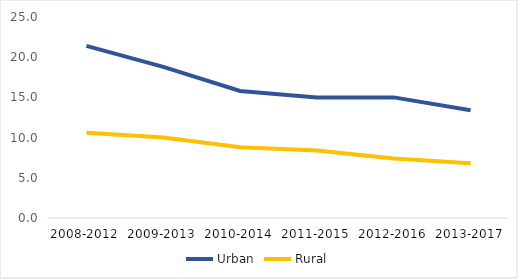
| Category | Urban | Rural |
|---|---|---|
| 2008-2012 | 21.4 | 10.6 |
| 2009-2013 | 18.8 | 10 |
| 2010-2014 | 15.8 | 8.8 |
| 2011-2015 | 15 | 8.4 |
| 2012-2016 | 15 | 7.4 |
| 2013-2017 | 13.4 | 6.8 |